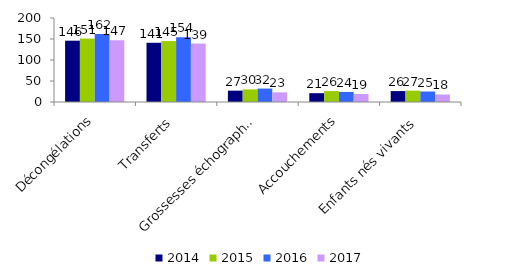
| Category | 2014 | 2015 | 2016 | 2017 |
|---|---|---|---|---|
| Décongélations | 146 | 151 | 162 | 147 |
| Transferts | 141 | 145 | 154 | 139 |
| Grossesses échographiques | 27 | 30 | 32 | 23 |
| Accouchements | 21 | 26 | 24 | 19 |
| Enfants nés vivants | 26 | 27 | 25 | 18 |